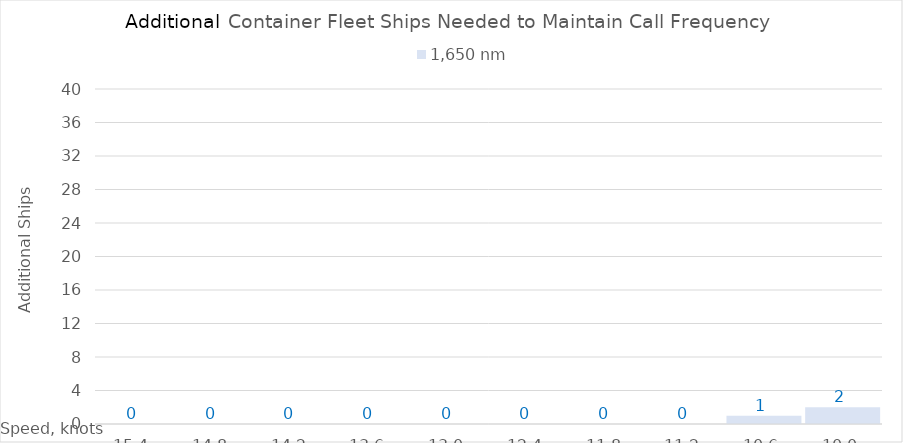
| Category | 1,650 |
|---|---|
| 15.4 | 0 |
| 14.8 | 0 |
| 14.200000000000001 | 0 |
| 13.600000000000001 | 0 |
| 13.000000000000002 | 0 |
| 12.400000000000002 | 0 |
| 11.800000000000002 | 0 |
| 11.200000000000003 | 0 |
| 10.600000000000003 | 1 |
| 10.000000000000004 | 2 |